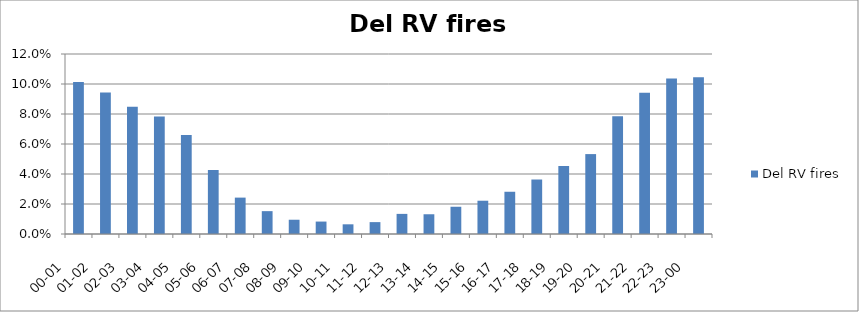
| Category | Del RV fires |
|---|---|
| 00-01      | 0.101 |
| 01-02      | 0.094 |
| 02-03      | 0.085 |
| 03-04      | 0.078 |
| 04-05      | 0.066 |
| 05-06      | 0.043 |
| 06-07      | 0.024 |
| 07-08      | 0.015 |
| 08-09      | 0.01 |
| 09-10      | 0.008 |
| 10-11      | 0.006 |
| 11-12      | 0.008 |
| 12-13      | 0.013 |
| 13-14      | 0.013 |
| 14-15      | 0.018 |
| 15-16      | 0.022 |
| 16-17      | 0.028 |
| 17-18      | 0.036 |
| 18-19      | 0.045 |
| 19-20      | 0.053 |
| 20-21      | 0.079 |
| 21-22      | 0.094 |
| 22-23      | 0.104 |
| 23-00      | 0.104 |